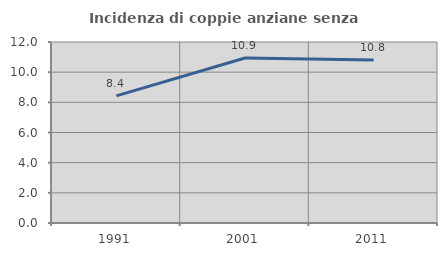
| Category | Incidenza di coppie anziane senza figli  |
|---|---|
| 1991.0 | 8.43 |
| 2001.0 | 10.938 |
| 2011.0 | 10.806 |